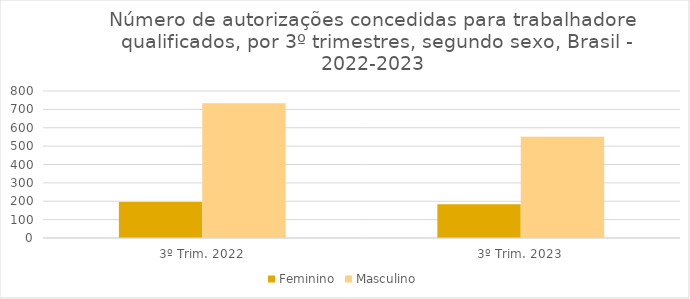
| Category | Feminino | Masculino |
|---|---|---|
| 3º Trim. 2022 | 196 | 734 |
| 3º Trim. 2023 | 184 | 551 |